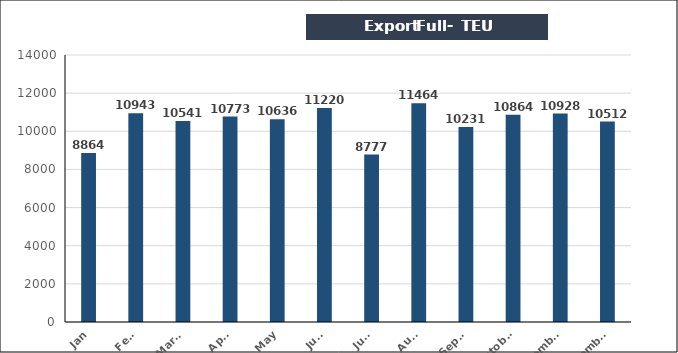
| Category | TEU |
|---|---|
| Jan | 8864 |
| Feb. | 10943 |
| March | 10541 |
| April | 10773 |
| May | 10636 |
| June | 11220 |
| July | 8777 |
| Aug. | 11464 |
| Sept. | 10231 |
| October | 10864 |
| November | 10928 |
| December | 10512 |